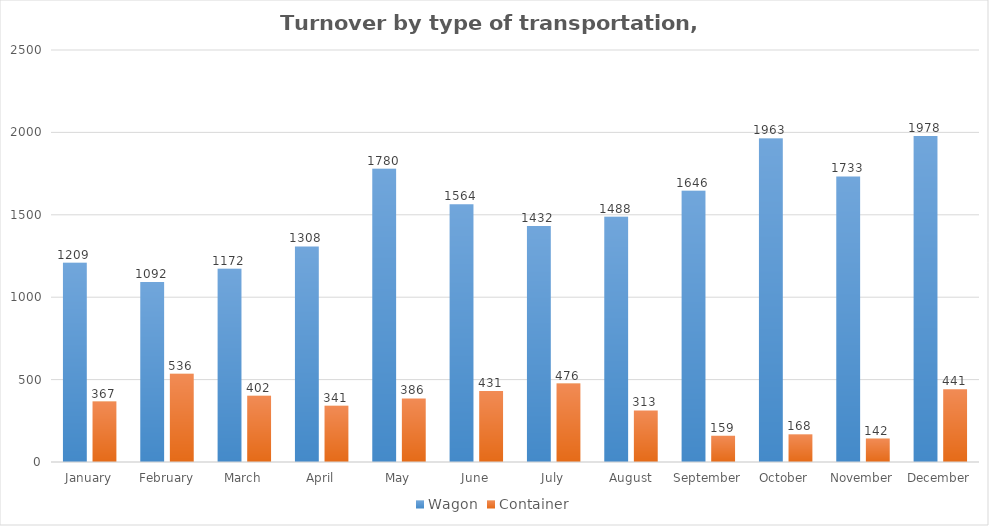
| Category | Wagon | Container |
|---|---|---|
| January | 1209 | 367 |
| February | 1092 | 536 |
| March | 1172 | 402 |
| April | 1308 | 341 |
| May | 1780 | 386 |
| June | 1564 | 431 |
| July | 1432 | 476 |
| August | 1488 | 313 |
| September | 1646 | 159 |
| October | 1963 | 168 |
| November | 1733 | 142 |
| December | 1978 | 441 |